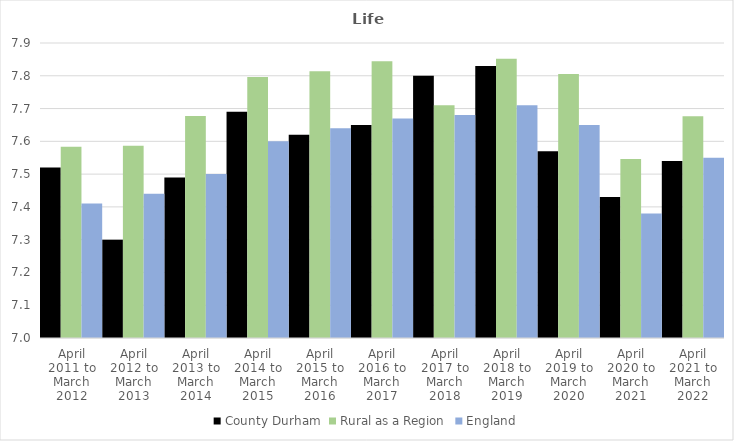
| Category | County Durham | Rural as a Region | England |
|---|---|---|---|
| April 2011 to March 2012 | 7.52 | 7.584 | 7.41 |
| April 2012 to March 2013 | 7.3 | 7.586 | 7.44 |
| April 2013 to March 2014 | 7.49 | 7.677 | 7.5 |
| April 2014 to March 2015 | 7.69 | 7.797 | 7.6 |
| April 2015 to March 2016 | 7.62 | 7.813 | 7.64 |
| April 2016 to March 2017 | 7.65 | 7.845 | 7.67 |
| April 2017 to March 2018 | 7.8 | 7.71 | 7.68 |
| April 2018 to March 2019 | 7.83 | 7.852 | 7.71 |
| April 2019 to March 2020 | 7.57 | 7.806 | 7.65 |
| April 2020 to March 2021 | 7.43 | 7.546 | 7.38 |
| April 2021 to March 2022 | 7.54 | 7.677 | 7.55 |